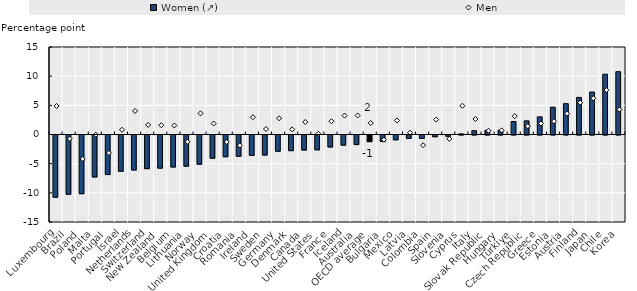
| Category | Women (↗) |
|---|---|
| Luxembourg | -10.666 |
| Brazil | -10.158 |
| Poland | -10.063 |
| Malta | -7.198 |
| Portugal | -6.785 |
| Israel | -6.218 |
| Netherlands | -6 |
| Switzerland | -5.768 |
| New Zealand | -5.678 |
| Belgium | -5.49 |
| Lithuania | -5.343 |
| Norway | -5.01 |
| United Kingdom | -3.98 |
| Croatia | -3.727 |
| Romania | -3.642 |
| Ireland | -3.493 |
| Sweden | -3.431 |
| Germany | -2.782 |
| Denmark | -2.68 |
| Canada | -2.579 |
| United States | -2.543 |
| France | -2.053 |
| Iceland | -1.739 |
| Australia | -1.64 |
| OECD average | -1.136 |
| Bulgaria | -1.121 |
| Mexico | -0.821 |
| Latvia | -0.592 |
| Colombia | -0.592 |
| Spain | -0.298 |
| Slovenia | -0.216 |
| Cyprus | 0.108 |
| Italy | 0.653 |
| Slovak Republic | 0.721 |
| Hungary | 0.738 |
| Türkiye | 2.222 |
| Czech Republic | 2.346 |
| Greece | 3.027 |
| Estonia | 4.68 |
| Austria | 5.286 |
| Finland | 6.362 |
| Japan | 7.281 |
| Chile | 10.334 |
| Korea | 10.769 |